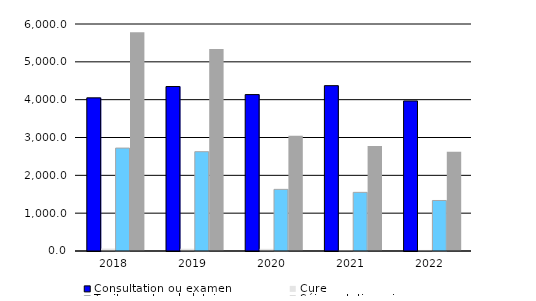
| Category | Consultation ou examen | Cure | Traitement ambulatoire | Séjour stationnaire |
|---|---|---|---|---|
| 2018.0 | 4048 | 65 | 2720 | 5782 |
| 2019.0 | 4347 | 61 | 2625 | 5339 |
| 2020.0 | 4134 | 58 | 1629 | 3049 |
| 2021.0 | 4370 | 26 | 1550 | 2777 |
| 2022.0 | 3966 | 28 | 1335 | 2621 |